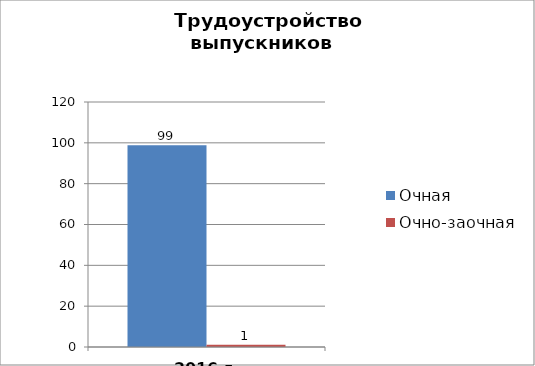
| Category | Очная | Очно-заочная |
|---|---|---|
| 2016 г. (%) | 98.876 | 1.124 |